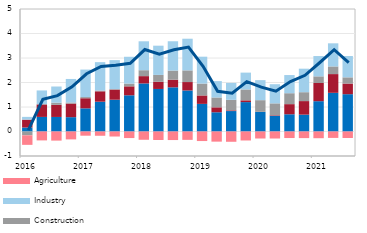
| Category | Other sectors | Trade | Construction | Industry | Agriculture |
|---|---|---|---|---|---|
| 2016 | 0.163 | 0.321 | -0.156 | 0.113 | -0.39 |
| II | 0.595 | 0.508 | 0.015 | 0.558 | -0.363 |
| III | 0.594 | 0.494 | 0.088 | 0.66 | -0.372 |
| IV | 0.585 | 0.553 | 0.046 | 0.96 | -0.322 |
| 2017 | 0.945 | 0.413 | 0.049 | 1.121 | -0.172 |
| II | 1.216 | 0.424 | 0.032 | 1.158 | -0.174 |
| III | 1.297 | 0.414 | 0.02 | 1.182 | -0.205 |
| IV | 1.478 | 0.366 | 0.113 | 1.094 | -0.268 |
| 2018 | 1.962 | 0.298 | 0.242 | 1.18 | -0.338 |
| II | 1.736 | 0.292 | 0.281 | 1.193 | -0.346 |
| III | 1.803 | 0.311 | 0.372 | 1.197 | -0.349 |
| IV | 1.675 | 0.344 | 0.476 | 1.293 | -0.341 |
| 2019 | 1.127 | 0.345 | 0.485 | 1.097 | -0.39 |
| II | 0.785 | 0.202 | 0.402 | 0.668 | -0.414 |
| III | 0.834 | 0.029 | 0.43 | 0.691 | -0.42 |
| IV | 1.2 | 0.072 | 0.444 | 0.687 | -0.366 |
| 2020 | 0.799 | 0.004 | 0.477 | 0.817 | -0.286 |
| II | 0.64 | 0.023 | 0.486 | 0.781 | -0.286 |
| III | 0.703 | 0.414 | 0.446 | 0.741 | -0.267 |
| IV | 0.688 | 0.553 | 0.363 | 0.959 | -0.27 |
| 2021 | 1.237 | 0.743 | 0.271 | 0.829 | -0.274 |
| II | 1.579 | 0.765 | 0.312 | 0.943 | -0.261 |
| III | 1.522 | 0.434 | 0.254 | 0.869 | -0.266 |